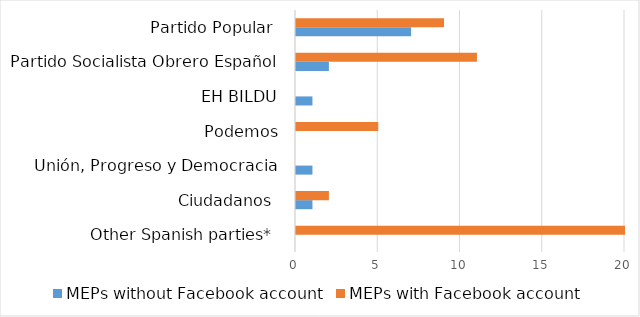
| Category | MEPs without Facebook account | MEPs with Facebook account |
|---|---|---|
| Other Spanish parties*  | 0 | 20 |
| Ciudadanos  | 1 | 2 |
| Unión, Progreso y Democracia | 1 | 0 |
| Podemos | 0 | 5 |
| EH BILDU | 1 | 0 |
| Partido Socialista Obrero Español | 2 | 11 |
| Partido Popular  | 7 | 9 |